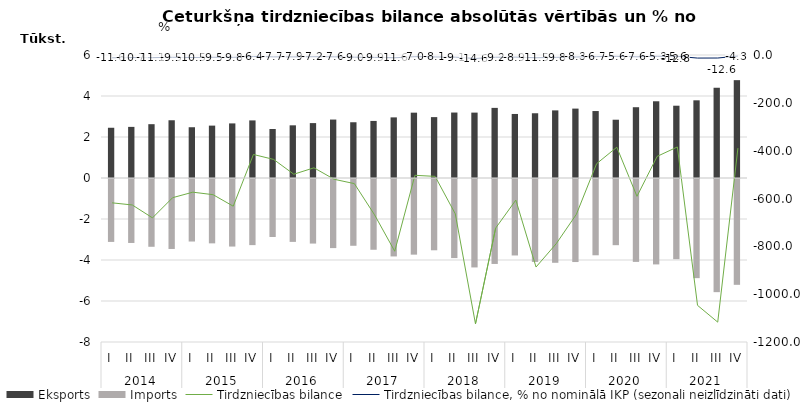
| Category | Eksports | Imports |
|---|---|---|
| 0 | 2450.7 | -3068.8 |
| 1 | 2493.4 | -3120.5 |
| 2 | 2625.5 | -3306.5 |
| 3 | 2816.7 | -3413.2 |
| 4 | 2476.5 | -3050.1 |
| 5 | 2555.2 | -3139.2 |
| 6 | 2663.4 | -3295.5 |
| 7 | 2809.5 | -3225.4 |
| 8 | 2391.5 | -2828.1 |
| 9 | 2569.5 | -3068 |
| 10 | 2678.2 | -3149.9 |
| 11 | 2850.8 | -3370.5 |
| 12 | 2719.6 | -3257.4 |
| 13 | 2783.8 | -3452 |
| 14 | 2956.9 | -3777.4 |
| 15 | 3187 | -3690 |
| 16 | 2969.9 | -3477.4 |
| 17 | 3193.3 | -3857.4 |
| 18 | 3189.7 | -4313.9 |
| 19 | 3420.5 | -4144.2 |
| 20 | 3123.6 | -3730.2 |
| 21 | 3158.2 | -4044.8 |
| 22 | 3298.5 | -4087.5 |
| 23 | 3385.3 | -4051.1 |
| 24 | 3266.4 | -3720.9 |
| 25 | 2842.7 | -3228.3 |
| 26 | 3452.8 | -4043.7 |
| 27 | 3742.7 | -4166.6 |
| 28 | 3526.4 | -3910.9 |
| 29 | 3789.6 | -4836.4 |
| 30 | 4402.4 | -5519.3 |
| 31 | 4772.9 | -5162.3 |